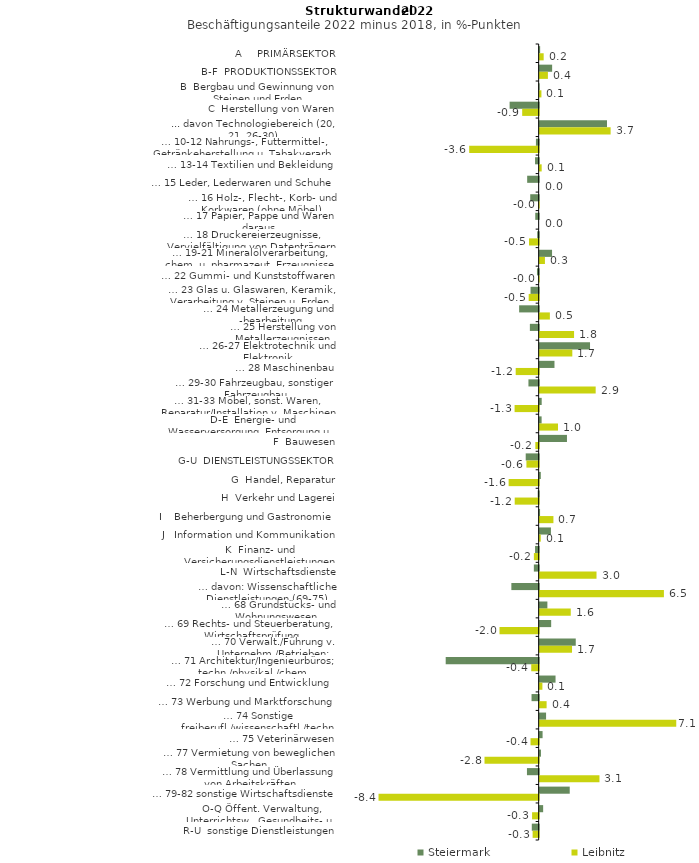
| Category | Steiermark | Leibnitz |
|---|---|---|
| A     PRIMÄRSEKTOR | 0.025 | 0.209 |
| B-F  PRODUKTIONSSEKTOR | 0.65 | 0.43 |
| B  Bergbau und Gewinnung von Steinen und Erden | -0.011 | 0.091 |
| C  Herstellung von Waren | -1.516 | -0.86 |
| ... davon Technologiebereich (20, 21, 26-30) | 3.513 | 3.702 |
| … 10-12 Nahrungs-, Futtermittel-, Getränkeherstellung u. Tabakverarb. | -0.143 | -3.625 |
| … 13-14 Textilien und Bekleidung | -0.189 | 0.105 |
| … 15 Leder, Lederwaren und Schuhe | -0.6 | 0 |
| … 16 Holz-, Flecht-, Korb- und Korkwaren (ohne Möbel)  | -0.44 | -0.022 |
| … 17 Papier, Pappe und Waren daraus  | -0.178 | 0 |
| … 18 Druckereierzeugnisse, Vervielfältigung von Datenträgern | -0.077 | -0.505 |
| … 19-21 Mineralölverarbeitung, chem. u. pharmazeut. Erzeugnisse | 0.646 | 0.275 |
| … 22 Gummi- und Kunststoffwaren | -0.089 | -0.021 |
| … 23 Glas u. Glaswaren, Keramik, Verarbeitung v. Steinen u. Erden  | -0.424 | -0.521 |
| … 24 Metallerzeugung und -bearbeitung | -1.019 | 0.532 |
| … 25 Herstellung von Metallerzeugnissen  | -0.459 | 1.795 |
| … 26-27 Elektrotechnik und Elektronik | 2.628 | 1.704 |
| … 28 Maschinenbau | 0.773 | -1.199 |
| … 29-30 Fahrzeugbau, sonstiger Fahrzeugbau | -0.534 | 2.922 |
| … 31-33 Möbel, sonst. Waren, Reparatur/Installation v. Maschinen | 0.106 | -1.256 |
| D-E  Energie- und Wasserversorgung, Entsorgung u. Rückgewinnung | 0.102 | 0.956 |
| F  Bauwesen | 1.424 | -0.174 |
| G-U  DIENSTLEISTUNGSSEKTOR | -0.676 | -0.639 |
| G  Handel, Reparatur | 0.059 | -1.568 |
| H  Verkehr und Lagerei | -0.05 | -1.25 |
| I    Beherbergung und Gastronomie | 0.02 | 0.718 |
| J   Information und Kommunikation | 0.588 | 0.057 |
| K  Finanz- und Versicherungsdienstleistungen | -0.188 | -0.25 |
| L-N  Wirtschaftsdienste | -0.252 | 2.966 |
| … davon: Wissenschaftliche Dienstleistungen (69-75) | -1.425 | 6.482 |
| … 68 Grundstücks- und Wohnungswesen  | 0.402 | 1.623 |
| … 69 Rechts- und Steuerberatung, Wirtschaftsprüfung | 0.6 | -2.043 |
| … 70 Verwalt./Führung v. Unternehm./Betrieben; Unternehmensberat. | 1.883 | 1.689 |
| … 71 Architektur/Ingenieurbüros; techn./physikal./chem. Untersuchung | -4.85 | -0.387 |
| … 72 Forschung und Entwicklung  | 0.828 | 0.143 |
| … 73 Werbung und Marktforschung | -0.372 | 0.362 |
| … 74 Sonstige freiberufl./wissenschaftl./techn. Tätigkeiten | 0.334 | 7.126 |
| … 75 Veterinärwesen | 0.152 | -0.425 |
| … 77 Vermietung von beweglichen Sachen  | 0.067 | -2.825 |
| … 78 Vermittlung und Überlassung von Arbeitskräften | -0.611 | 3.12 |
| … 79-82 sonstige Wirtschaftsdienste | 1.569 | -8.355 |
| O-Q Öffent. Verwaltung, Unterrichtsw., Gesundheits- u. Sozialwesen | 0.182 | -0.344 |
| R-U  sonstige Dienstleistungen | -0.359 | -0.316 |